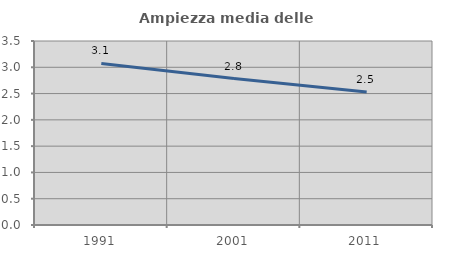
| Category | Ampiezza media delle famiglie |
|---|---|
| 1991.0 | 3.072 |
| 2001.0 | 2.786 |
| 2011.0 | 2.528 |